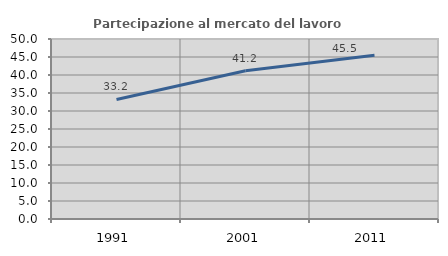
| Category | Partecipazione al mercato del lavoro  femminile |
|---|---|
| 1991.0 | 33.205 |
| 2001.0 | 41.165 |
| 2011.0 | 45.481 |